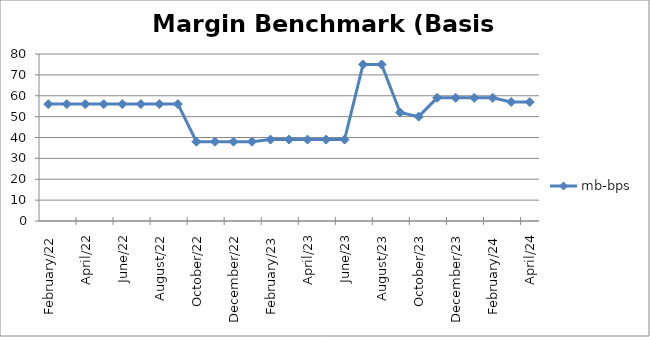
| Category | mb-bps |
|---|---|
| 2022-02-15 | 56 |
| 2022-03-15 | 56 |
| 2022-04-15 | 56 |
| 2022-05-15 | 56 |
| 2022-06-15 | 56 |
| 2022-07-15 | 56 |
| 2022-08-15 | 56 |
| 2022-09-15 | 56 |
| 2022-10-15 | 38 |
| 2022-11-15 | 38 |
| 2022-12-15 | 38 |
| 2023-01-15 | 38 |
| 2023-02-15 | 39 |
| 2023-03-15 | 39 |
| 2023-04-15 | 39 |
| 2023-05-15 | 39 |
| 2023-06-15 | 39 |
| 2023-07-15 | 75 |
| 2023-08-15 | 75 |
| 2023-09-15 | 52 |
| 2023-10-15 | 50 |
| 2023-11-15 | 59 |
| 2023-12-15 | 59 |
| 2024-01-15 | 59 |
| 2024-02-15 | 59 |
| 2024-03-15 | 57 |
| 2024-04-15 | 57 |